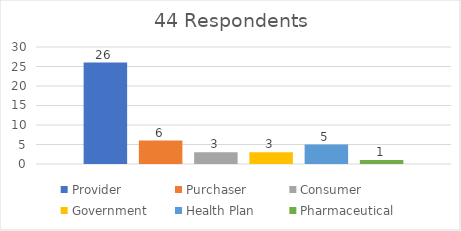
| Category | Provider | Purchaser | Consumer | Government | Health Plan | Pharmaceutical |
|---|---|---|---|---|---|---|
| 0 | 26 | 6 | 3 | 3 | 5 | 1 |